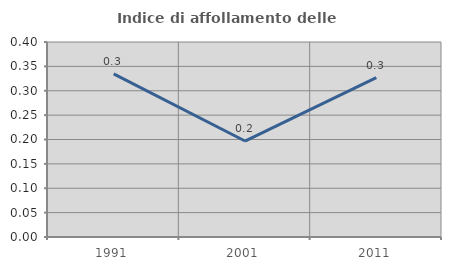
| Category | Indice di affollamento delle abitazioni  |
|---|---|
| 1991.0 | 0.334 |
| 2001.0 | 0.197 |
| 2011.0 | 0.327 |